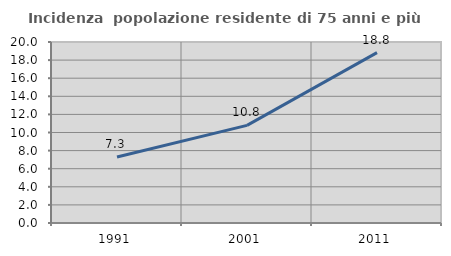
| Category | Incidenza  popolazione residente di 75 anni e più |
|---|---|
| 1991.0 | 7.29 |
| 2001.0 | 10.791 |
| 2011.0 | 18.824 |